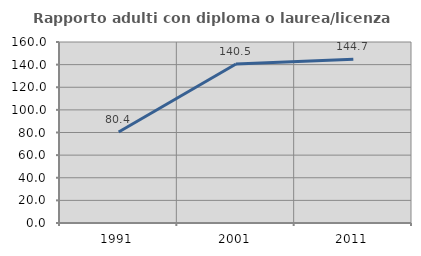
| Category | Rapporto adulti con diploma o laurea/licenza media  |
|---|---|
| 1991.0 | 80.376 |
| 2001.0 | 140.491 |
| 2011.0 | 144.746 |